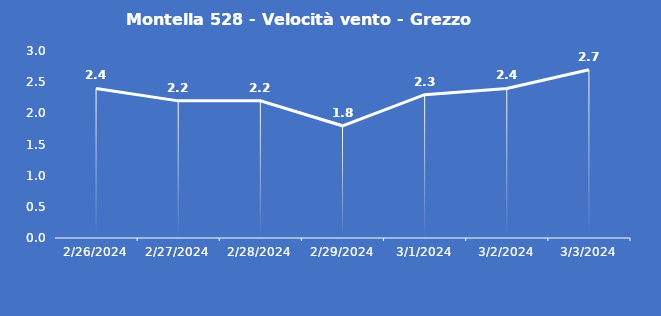
| Category | Montella 528 - Velocità vento - Grezzo (m/s) |
|---|---|
| 2/26/24 | 2.4 |
| 2/27/24 | 2.2 |
| 2/28/24 | 2.2 |
| 2/29/24 | 1.8 |
| 3/1/24 | 2.3 |
| 3/2/24 | 2.4 |
| 3/3/24 | 2.7 |